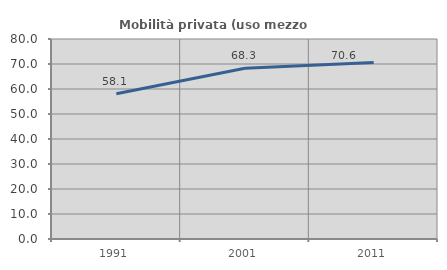
| Category | Mobilità privata (uso mezzo privato) |
|---|---|
| 1991.0 | 58.072 |
| 2001.0 | 68.273 |
| 2011.0 | 70.569 |